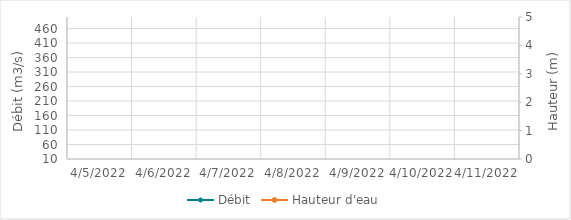
| Category | Débit |
|---|---|
| 2/23/22 | 322.81 |
| 2/22/22 | 341.9 |
| 2/21/22 | 388.85 |
| 2/20/22 | 427.81 |
| 2/19/22 | 415.12 |
| 2/18/22 | 354.31 |
| 2/17/22 | 371.69 |